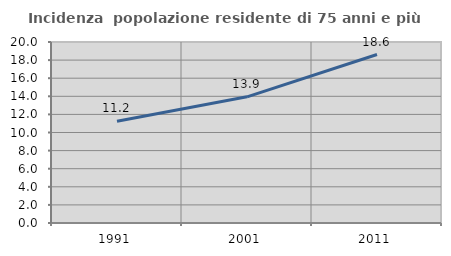
| Category | Incidenza  popolazione residente di 75 anni e più |
|---|---|
| 1991.0 | 11.247 |
| 2001.0 | 13.941 |
| 2011.0 | 18.619 |